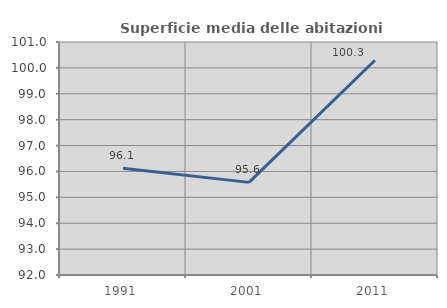
| Category | Superficie media delle abitazioni occupate |
|---|---|
| 1991.0 | 96.123 |
| 2001.0 | 95.578 |
| 2011.0 | 100.294 |